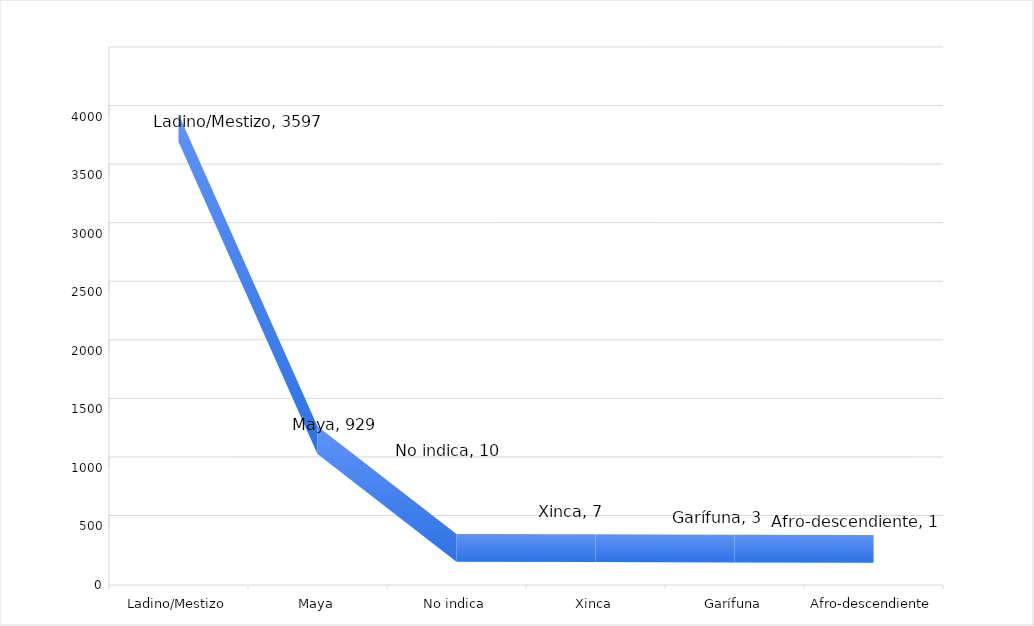
| Category | Series 0 |
|---|---|
| Ladino/Mestizo | 3597 |
| Maya | 929 |
| No indica | 10 |
| Xinca | 7 |
| Garífuna | 3 |
| Afro-descendiente | 1 |